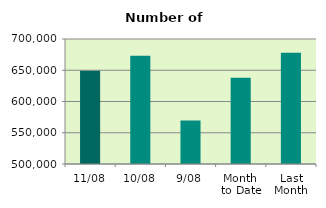
| Category | Series 0 |
|---|---|
| 11/08 | 649372 |
| 10/08 | 673216 |
| 9/08 | 569426 |
| Month 
to Date | 638057.778 |
| Last
Month | 677996.667 |